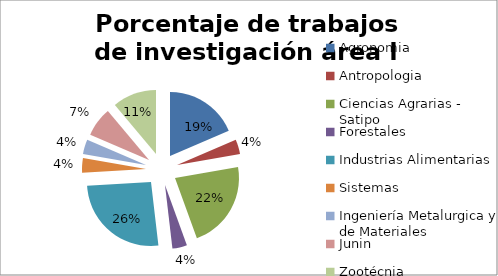
| Category | Nº |
|---|---|
| Agronomia | 5 |
| Antropologia | 1 |
| Ciencias Agrarias - Satipo | 6 |
| Forestales | 1 |
| Industrias Alimentarias | 7 |
| Sistemas | 1 |
| Ingeniería Metalurgica y de Materiales | 1 |
| Junin | 2 |
| Zootécnia | 3 |